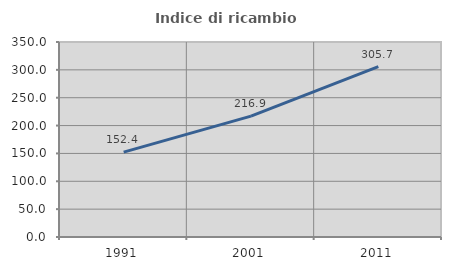
| Category | Indice di ricambio occupazionale  |
|---|---|
| 1991.0 | 152.381 |
| 2001.0 | 216.901 |
| 2011.0 | 305.66 |